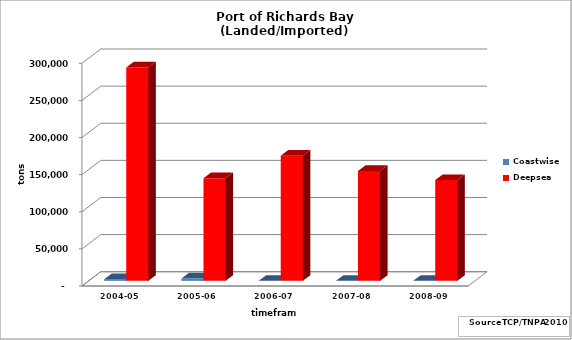
| Category | Coastwise | Deepsea |
|---|---|---|
| 2004-05 | 2308 | 287368 |
| 2005-06 | 3065 | 138261 |
| 2006-07 | 0 | 168457 |
| 2007-08 | 0 | 147951 |
| 2008-09 | 0 | 135690 |